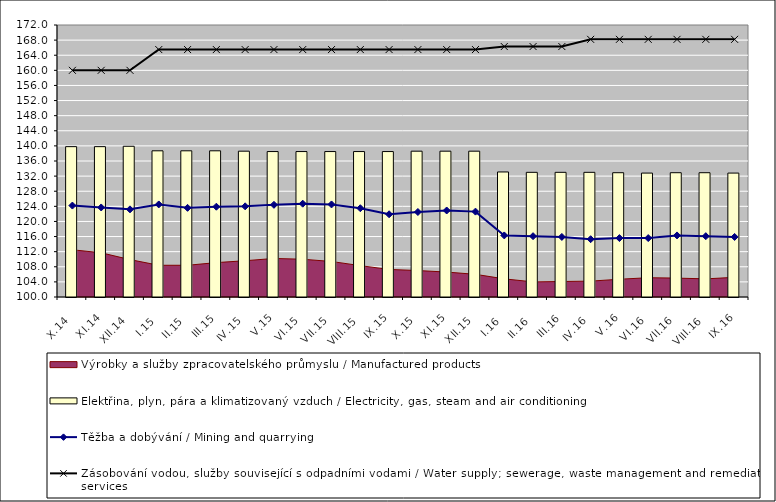
| Category | Elektřina, plyn, pára a klimatizovaný vzduch / Electricity, gas, steam and air conditioning |
|---|---|
| X.14 | 139.8 |
| XI.14 | 139.8 |
| XII.14 | 139.9 |
| I.15 | 138.7 |
| II.15 | 138.7 |
| III.15 | 138.7 |
| IV.15 | 138.6 |
| V.15 | 138.5 |
| VI.15 | 138.5 |
| VII.15 | 138.5 |
| VIII.15 | 138.5 |
| IX.15 | 138.5 |
| X.15 | 138.6 |
| XI.15 | 138.6 |
| XII.15 | 138.6 |
| I.16 | 133.1 |
| II.16 | 133 |
| III.16 | 133 |
| IV.16 | 133 |
| V.16 | 132.9 |
| VI.16 | 132.8 |
| VII.16 | 132.9 |
| VIII.16 | 132.9 |
| IX.16 | 132.8 |